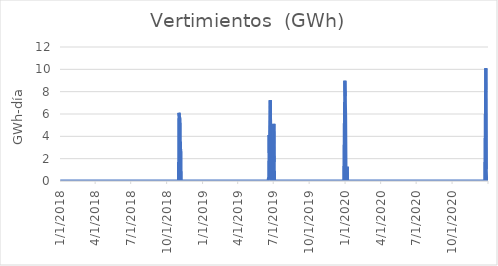
| Category | Vertimientos  (GWh) |
|---|---|
| 1/1/18 | 0 |
| 1/2/18 | 0 |
| 1/3/18 | 0 |
| 1/4/18 | 0 |
| 1/5/18 | 0 |
| 1/6/18 | 0 |
| 1/7/18 | 0 |
| 1/8/18 | 0 |
| 1/9/18 | 0 |
| 1/10/18 | 0 |
| 1/11/18 | 0 |
| 1/12/18 | 0 |
| 1/13/18 | 0 |
| 1/14/18 | 0 |
| 1/15/18 | 0 |
| 1/16/18 | 0 |
| 1/17/18 | 0 |
| 1/18/18 | 0 |
| 1/19/18 | 0 |
| 1/20/18 | 0 |
| 1/21/18 | 0 |
| 1/22/18 | 0 |
| 1/23/18 | 0 |
| 1/24/18 | 0 |
| 1/25/18 | 0 |
| 1/26/18 | 0 |
| 1/27/18 | 0 |
| 1/28/18 | 0 |
| 1/29/18 | 0 |
| 1/30/18 | 0 |
| 1/31/18 | 0 |
| 2/1/18 | 0 |
| 2/2/18 | 0 |
| 2/3/18 | 0 |
| 2/4/18 | 0 |
| 2/5/18 | 0 |
| 2/6/18 | 0 |
| 2/7/18 | 0 |
| 2/8/18 | 0 |
| 2/9/18 | 0 |
| 2/10/18 | 0 |
| 2/11/18 | 0 |
| 2/12/18 | 0 |
| 2/13/18 | 0 |
| 2/14/18 | 0 |
| 2/15/18 | 0 |
| 2/16/18 | 0 |
| 2/17/18 | 0 |
| 2/18/18 | 0 |
| 2/19/18 | 0 |
| 2/20/18 | 0 |
| 2/21/18 | 0 |
| 2/22/18 | 0 |
| 2/23/18 | 0 |
| 2/24/18 | 0 |
| 2/25/18 | 0 |
| 2/26/18 | 0 |
| 2/27/18 | 0 |
| 2/28/18 | 0 |
| 3/1/18 | 0 |
| 3/2/18 | 0 |
| 3/3/18 | 0 |
| 3/4/18 | 0 |
| 3/5/18 | 0 |
| 3/6/18 | 0 |
| 3/7/18 | 0 |
| 3/8/18 | 0 |
| 3/9/18 | 0 |
| 3/10/18 | 0 |
| 3/11/18 | 0 |
| 3/12/18 | 0 |
| 3/13/18 | 0 |
| 3/14/18 | 0 |
| 3/15/18 | 0 |
| 3/16/18 | 0 |
| 3/17/18 | 0 |
| 3/18/18 | 0 |
| 3/19/18 | 0 |
| 3/20/18 | 0 |
| 3/21/18 | 0 |
| 3/22/18 | 0 |
| 3/23/18 | 0 |
| 3/24/18 | 0 |
| 3/25/18 | 0 |
| 3/26/18 | 0 |
| 3/27/18 | 0 |
| 3/28/18 | 0 |
| 3/29/18 | 0 |
| 3/30/18 | 0 |
| 3/31/18 | 0 |
| 4/1/18 | 0 |
| 4/2/18 | 0 |
| 4/3/18 | 0 |
| 4/4/18 | 0 |
| 4/5/18 | 0 |
| 4/6/18 | 0 |
| 4/7/18 | 0 |
| 4/8/18 | 0 |
| 4/9/18 | 0 |
| 4/10/18 | 0 |
| 4/11/18 | 0 |
| 4/12/18 | 0 |
| 4/13/18 | 0 |
| 4/14/18 | 0 |
| 4/15/18 | 0 |
| 4/16/18 | 0 |
| 4/17/18 | 0 |
| 4/18/18 | 0 |
| 4/19/18 | 0 |
| 4/20/18 | 0 |
| 4/21/18 | 0 |
| 4/22/18 | 0 |
| 4/23/18 | 0 |
| 4/24/18 | 0 |
| 4/25/18 | 0 |
| 4/26/18 | 0 |
| 4/27/18 | 0 |
| 4/28/18 | 0 |
| 4/29/18 | 0 |
| 4/30/18 | 0 |
| 5/1/18 | 0 |
| 5/2/18 | 0 |
| 5/3/18 | 0 |
| 5/4/18 | 0 |
| 5/5/18 | 0 |
| 5/6/18 | 0 |
| 5/7/18 | 0 |
| 5/8/18 | 0 |
| 5/9/18 | 0 |
| 5/10/18 | 0 |
| 5/11/18 | 0 |
| 5/12/18 | 0 |
| 5/13/18 | 0 |
| 5/14/18 | 0 |
| 5/15/18 | 0 |
| 5/16/18 | 0 |
| 5/17/18 | 0 |
| 5/18/18 | 0 |
| 5/19/18 | 0 |
| 5/20/18 | 0 |
| 5/21/18 | 0 |
| 5/22/18 | 0 |
| 5/23/18 | 0 |
| 5/24/18 | 0 |
| 5/25/18 | 0 |
| 5/26/18 | 0 |
| 5/27/18 | 0 |
| 5/28/18 | 0 |
| 5/29/18 | 0 |
| 5/30/18 | 0 |
| 5/31/18 | 0 |
| 6/1/18 | 0 |
| 6/2/18 | 0 |
| 6/3/18 | 0 |
| 6/4/18 | 0 |
| 6/5/18 | 0 |
| 6/6/18 | 0 |
| 6/7/18 | 0 |
| 6/8/18 | 0 |
| 6/9/18 | 0 |
| 6/10/18 | 0 |
| 6/11/18 | 0 |
| 6/12/18 | 0 |
| 6/13/18 | 0 |
| 6/14/18 | 0 |
| 6/15/18 | 0 |
| 6/16/18 | 0 |
| 6/17/18 | 0 |
| 6/18/18 | 0 |
| 6/19/18 | 0 |
| 6/20/18 | 0 |
| 6/21/18 | 0 |
| 6/22/18 | 0 |
| 6/23/18 | 0 |
| 6/24/18 | 0 |
| 6/25/18 | 0 |
| 6/26/18 | 0 |
| 6/27/18 | 0 |
| 6/28/18 | 0 |
| 6/29/18 | 0 |
| 6/30/18 | 0 |
| 7/1/18 | 0 |
| 7/2/18 | 0 |
| 7/3/18 | 0 |
| 7/4/18 | 0 |
| 7/5/18 | 0 |
| 7/6/18 | 0 |
| 7/7/18 | 0 |
| 7/8/18 | 0 |
| 7/9/18 | 0 |
| 7/10/18 | 0 |
| 7/11/18 | 0 |
| 7/12/18 | 0 |
| 7/13/18 | 0 |
| 7/14/18 | 0 |
| 7/15/18 | 0 |
| 7/16/18 | 0 |
| 7/17/18 | 0 |
| 7/18/18 | 0 |
| 7/19/18 | 0 |
| 7/20/18 | 0 |
| 7/21/18 | 0 |
| 7/22/18 | 0 |
| 7/23/18 | 0 |
| 7/24/18 | 0 |
| 7/25/18 | 0 |
| 7/26/18 | 0 |
| 7/27/18 | 0 |
| 7/28/18 | 0 |
| 7/29/18 | 0 |
| 7/30/18 | 0 |
| 7/31/18 | 0 |
| 8/1/18 | 0 |
| 8/2/18 | 0 |
| 8/3/18 | 0 |
| 8/4/18 | 0 |
| 8/5/18 | 0 |
| 8/6/18 | 0 |
| 8/7/18 | 0 |
| 8/8/18 | 0 |
| 8/9/18 | 0 |
| 8/10/18 | 0 |
| 8/11/18 | 0 |
| 8/12/18 | 0 |
| 8/13/18 | 0 |
| 8/14/18 | 0 |
| 8/15/18 | 0 |
| 8/16/18 | 0 |
| 8/17/18 | 0 |
| 8/18/18 | 0 |
| 8/19/18 | 0 |
| 8/20/18 | 0 |
| 8/21/18 | 0 |
| 8/22/18 | 0 |
| 8/23/18 | 0 |
| 8/24/18 | 0 |
| 8/25/18 | 0 |
| 8/26/18 | 0 |
| 8/27/18 | 0 |
| 8/28/18 | 0 |
| 8/29/18 | 0 |
| 8/30/18 | 0 |
| 8/31/18 | 0 |
| 9/1/18 | 0 |
| 9/2/18 | 0 |
| 9/3/18 | 0 |
| 9/4/18 | 0 |
| 9/5/18 | 0 |
| 9/6/18 | 0 |
| 9/7/18 | 0 |
| 9/8/18 | 0 |
| 9/9/18 | 0 |
| 9/10/18 | 0 |
| 9/11/18 | 0 |
| 9/12/18 | 0 |
| 9/13/18 | 0 |
| 9/14/18 | 0 |
| 9/15/18 | 0 |
| 9/16/18 | 0 |
| 9/17/18 | 0 |
| 9/18/18 | 0 |
| 9/19/18 | 0 |
| 9/20/18 | 0 |
| 9/21/18 | 0 |
| 9/22/18 | 0 |
| 9/23/18 | 0 |
| 9/24/18 | 0 |
| 9/25/18 | 0 |
| 9/26/18 | 0 |
| 9/27/18 | 0 |
| 9/28/18 | 0 |
| 9/29/18 | 0 |
| 9/30/18 | 0 |
| 10/1/18 | 0 |
| 10/2/18 | 0 |
| 10/3/18 | 0 |
| 10/4/18 | 0 |
| 10/5/18 | 0 |
| 10/6/18 | 0 |
| 10/7/18 | 0 |
| 10/8/18 | 0 |
| 10/9/18 | 0 |
| 10/10/18 | 0 |
| 10/11/18 | 0 |
| 10/12/18 | 0 |
| 10/13/18 | 0 |
| 10/14/18 | 0 |
| 10/15/18 | 0 |
| 10/16/18 | 0 |
| 10/17/18 | 0 |
| 10/18/18 | 0 |
| 10/19/18 | 0 |
| 10/20/18 | 0 |
| 10/21/18 | 0 |
| 10/22/18 | 0 |
| 10/23/18 | 0 |
| 10/24/18 | 0 |
| 10/25/18 | 0 |
| 10/26/18 | 0 |
| 10/27/18 | 0 |
| 10/28/18 | 0 |
| 10/29/18 | 0 |
| 10/30/18 | 0 |
| 10/31/18 | 0 |
| 11/1/18 | 6.102 |
| 11/2/18 | 5.848 |
| 11/3/18 | 5.917 |
| 11/4/18 | 5.528 |
| 11/5/18 | 2.917 |
| 11/6/18 | 2.766 |
| 11/7/18 | 0 |
| 11/8/18 | 0 |
| 11/9/18 | 0 |
| 11/10/18 | 0 |
| 11/11/18 | 0 |
| 11/12/18 | 0 |
| 11/13/18 | 0 |
| 11/14/18 | 0 |
| 11/15/18 | 0 |
| 11/16/18 | 0 |
| 11/17/18 | 0 |
| 11/18/18 | 0 |
| 11/19/18 | 0 |
| 11/20/18 | 0 |
| 11/21/18 | 0 |
| 11/22/18 | 0 |
| 11/23/18 | 0 |
| 11/24/18 | 0 |
| 11/25/18 | 0 |
| 11/26/18 | 0 |
| 11/27/18 | 0 |
| 11/28/18 | 0 |
| 11/29/18 | 0 |
| 11/30/18 | 0 |
| 12/1/18 | 0 |
| 12/2/18 | 0 |
| 12/3/18 | 0 |
| 12/4/18 | 0 |
| 12/5/18 | 0 |
| 12/6/18 | 0 |
| 12/7/18 | 0 |
| 12/8/18 | 0 |
| 12/9/18 | 0 |
| 12/10/18 | 0 |
| 12/11/18 | 0 |
| 12/12/18 | 0 |
| 12/13/18 | 0 |
| 12/14/18 | 0 |
| 12/15/18 | 0 |
| 12/16/18 | 0 |
| 12/17/18 | 0 |
| 12/18/18 | 0 |
| 12/19/18 | 0 |
| 12/20/18 | 0 |
| 12/21/18 | 0 |
| 12/22/18 | 0 |
| 12/23/18 | 0 |
| 12/24/18 | 0 |
| 12/25/18 | 0 |
| 12/26/18 | 0 |
| 12/27/18 | 0 |
| 12/28/18 | 0 |
| 12/29/18 | 0 |
| 12/30/18 | 0 |
| 12/31/18 | 0 |
| 1/1/19 | 0 |
| 1/2/19 | 0 |
| 1/3/19 | 0 |
| 1/4/19 | 0 |
| 1/5/19 | 0 |
| 1/6/19 | 0 |
| 1/7/19 | 0 |
| 1/8/19 | 0 |
| 1/9/19 | 0 |
| 1/10/19 | 0 |
| 1/11/19 | 0 |
| 1/12/19 | 0 |
| 1/13/19 | 0 |
| 1/14/19 | 0 |
| 1/15/19 | 0 |
| 1/16/19 | 0 |
| 1/17/19 | 0 |
| 1/18/19 | 0 |
| 1/19/19 | 0 |
| 1/20/19 | 0 |
| 1/21/19 | 0 |
| 1/22/19 | 0 |
| 1/23/19 | 0 |
| 1/24/19 | 0 |
| 1/25/19 | 0 |
| 1/26/19 | 0 |
| 1/27/19 | 0 |
| 1/28/19 | 0 |
| 1/29/19 | 0 |
| 1/30/19 | 0 |
| 1/31/19 | 0 |
| 2/1/19 | 0 |
| 2/2/19 | 0 |
| 2/3/19 | 0 |
| 2/4/19 | 0 |
| 2/5/19 | 0 |
| 2/6/19 | 0 |
| 2/7/19 | 0 |
| 2/8/19 | 0 |
| 2/9/19 | 0 |
| 2/10/19 | 0 |
| 2/11/19 | 0 |
| 2/12/19 | 0 |
| 2/13/19 | 0 |
| 2/14/19 | 0 |
| 2/15/19 | 0 |
| 2/16/19 | 0 |
| 2/17/19 | 0 |
| 2/18/19 | 0 |
| 2/19/19 | 0 |
| 2/20/19 | 0 |
| 2/21/19 | 0 |
| 2/22/19 | 0 |
| 2/23/19 | 0 |
| 2/24/19 | 0 |
| 2/25/19 | 0 |
| 2/26/19 | 0 |
| 2/27/19 | 0 |
| 2/28/19 | 0 |
| 3/1/19 | 0 |
| 3/2/19 | 0 |
| 3/3/19 | 0 |
| 3/4/19 | 0 |
| 3/5/19 | 0 |
| 3/6/19 | 0 |
| 3/7/19 | 0 |
| 3/8/19 | 0 |
| 3/9/19 | 0 |
| 3/10/19 | 0 |
| 3/11/19 | 0 |
| 3/12/19 | 0 |
| 3/13/19 | 0 |
| 3/14/19 | 0 |
| 3/15/19 | 0 |
| 3/16/19 | 0 |
| 3/17/19 | 0 |
| 3/18/19 | 0 |
| 3/19/19 | 0 |
| 3/20/19 | 0 |
| 3/21/19 | 0 |
| 3/22/19 | 0 |
| 3/23/19 | 0 |
| 3/24/19 | 0 |
| 3/25/19 | 0 |
| 3/26/19 | 0 |
| 3/27/19 | 0 |
| 3/28/19 | 0 |
| 3/29/19 | 0 |
| 3/30/19 | 0 |
| 3/31/19 | 0 |
| 4/1/19 | 0 |
| 4/2/19 | 0 |
| 4/3/19 | 0 |
| 4/4/19 | 0 |
| 4/5/19 | 0 |
| 4/6/19 | 0 |
| 4/7/19 | 0 |
| 4/8/19 | 0 |
| 4/9/19 | 0 |
| 4/10/19 | 0 |
| 4/11/19 | 0 |
| 4/12/19 | 0 |
| 4/13/19 | 0 |
| 4/14/19 | 0 |
| 4/15/19 | 0 |
| 4/16/19 | 0 |
| 4/17/19 | 0 |
| 4/18/19 | 0 |
| 4/19/19 | 0 |
| 4/20/19 | 0 |
| 4/21/19 | 0 |
| 4/22/19 | 0 |
| 4/23/19 | 0 |
| 4/24/19 | 0 |
| 4/25/19 | 0 |
| 4/26/19 | 0 |
| 4/27/19 | 0 |
| 4/28/19 | 0 |
| 4/29/19 | 0 |
| 4/30/19 | 0 |
| 5/1/19 | 0 |
| 5/2/19 | 0 |
| 5/3/19 | 0 |
| 5/4/19 | 0 |
| 5/5/19 | 0 |
| 5/6/19 | 0 |
| 5/7/19 | 0 |
| 5/8/19 | 0 |
| 5/9/19 | 0 |
| 5/10/19 | 0 |
| 5/11/19 | 0 |
| 5/12/19 | 0 |
| 5/13/19 | 0 |
| 5/14/19 | 0 |
| 5/15/19 | 0 |
| 5/16/19 | 0 |
| 5/17/19 | 0 |
| 5/18/19 | 0 |
| 5/19/19 | 0 |
| 5/20/19 | 0 |
| 5/21/19 | 0 |
| 5/22/19 | 0 |
| 5/23/19 | 0 |
| 5/24/19 | 0 |
| 5/25/19 | 0 |
| 5/26/19 | 0 |
| 5/27/19 | 0 |
| 5/28/19 | 0 |
| 5/29/19 | 0 |
| 5/30/19 | 0 |
| 5/31/19 | 0 |
| 6/1/19 | 0 |
| 6/2/19 | 0 |
| 6/3/19 | 0 |
| 6/4/19 | 0 |
| 6/5/19 | 0 |
| 6/6/19 | 0 |
| 6/7/19 | 0 |
| 6/8/19 | 0 |
| 6/9/19 | 0 |
| 6/10/19 | 0 |
| 6/11/19 | 0 |
| 6/12/19 | 0 |
| 6/13/19 | 0 |
| 6/14/19 | 0 |
| 6/15/19 | 0 |
| 6/16/19 | 0 |
| 6/17/19 | 0 |
| 6/18/19 | 0 |
| 6/19/19 | 0.379 |
| 6/20/19 | 4.089 |
| 6/21/19 | 1.693 |
| 6/22/19 | 1.711 |
| 6/23/19 | 7.235 |
| 6/24/19 | 4.426 |
| 6/25/19 | 0 |
| 6/26/19 | 3.737 |
| 6/27/19 | 0 |
| 6/28/19 | 0 |
| 6/29/19 | 0 |
| 6/30/19 | 1.952 |
| 7/1/19 | 0.442 |
| 7/2/19 | 5.115 |
| 7/3/19 | 1.692 |
| 7/4/19 | 0.068 |
| 7/5/19 | 0 |
| 7/6/19 | 0 |
| 7/7/19 | 0 |
| 7/8/19 | 0 |
| 7/9/19 | 0 |
| 7/10/19 | 0 |
| 7/11/19 | 0 |
| 7/12/19 | 0 |
| 7/13/19 | 0 |
| 7/14/19 | 0 |
| 7/15/19 | 0 |
| 7/16/19 | 0 |
| 7/17/19 | 0 |
| 7/18/19 | 0 |
| 7/19/19 | 0 |
| 7/20/19 | 0 |
| 7/21/19 | 0 |
| 7/22/19 | 0 |
| 7/23/19 | 0 |
| 7/24/19 | 0 |
| 7/25/19 | 0 |
| 7/26/19 | 0 |
| 7/27/19 | 0 |
| 7/28/19 | 0 |
| 7/29/19 | 0 |
| 7/30/19 | 0 |
| 7/31/19 | 0 |
| 8/1/19 | 0 |
| 8/2/19 | 0 |
| 8/3/19 | 0 |
| 8/4/19 | 0 |
| 8/5/19 | 0 |
| 8/6/19 | 0 |
| 8/7/19 | 0 |
| 8/8/19 | 0 |
| 8/9/19 | 0 |
| 8/10/19 | 0 |
| 8/11/19 | 0 |
| 8/12/19 | 0 |
| 8/13/19 | 0 |
| 8/14/19 | 0 |
| 8/15/19 | 0 |
| 8/16/19 | 0 |
| 8/17/19 | 0 |
| 8/18/19 | 0 |
| 8/19/19 | 0 |
| 8/20/19 | 0 |
| 8/21/19 | 0 |
| 8/22/19 | 0 |
| 8/23/19 | 0 |
| 8/24/19 | 0 |
| 8/25/19 | 0 |
| 8/26/19 | 0 |
| 8/27/19 | 0 |
| 8/28/19 | 0 |
| 8/29/19 | 0 |
| 8/30/19 | 0 |
| 8/31/19 | 0 |
| 9/1/19 | 0 |
| 9/2/19 | 0 |
| 9/3/19 | 0 |
| 9/4/19 | 0 |
| 9/5/19 | 0 |
| 9/6/19 | 0 |
| 9/7/19 | 0 |
| 9/8/19 | 0 |
| 9/9/19 | 0 |
| 9/10/19 | 0 |
| 9/11/19 | 0 |
| 9/12/19 | 0 |
| 9/13/19 | 0 |
| 9/14/19 | 0 |
| 9/15/19 | 0 |
| 9/16/19 | 0 |
| 9/17/19 | 0 |
| 9/18/19 | 0 |
| 9/19/19 | 0 |
| 9/20/19 | 0 |
| 9/21/19 | 0 |
| 9/22/19 | 0 |
| 9/23/19 | 0 |
| 9/24/19 | 0 |
| 9/25/19 | 0 |
| 9/26/19 | 0 |
| 9/27/19 | 0 |
| 9/28/19 | 0 |
| 9/29/19 | 0 |
| 9/30/19 | 0 |
| 10/1/19 | 0 |
| 10/2/19 | 0 |
| 10/3/19 | 0 |
| 10/4/19 | 0 |
| 10/5/19 | 0 |
| 10/6/19 | 0 |
| 10/7/19 | 0 |
| 10/8/19 | 0 |
| 10/9/19 | 0 |
| 10/10/19 | 0 |
| 10/11/19 | 0 |
| 10/12/19 | 0 |
| 10/13/19 | 0 |
| 10/14/19 | 0 |
| 10/15/19 | 0 |
| 10/16/19 | 0 |
| 10/17/19 | 0 |
| 10/18/19 | 0 |
| 10/19/19 | 0 |
| 10/20/19 | 0 |
| 10/21/19 | 0 |
| 10/22/19 | 0 |
| 10/23/19 | 0 |
| 10/24/19 | 0 |
| 10/25/19 | 0 |
| 10/26/19 | 0 |
| 10/27/19 | 0 |
| 10/28/19 | 0 |
| 10/29/19 | 0 |
| 10/30/19 | 0 |
| 10/31/19 | 0 |
| 11/1/19 | 0 |
| 11/2/19 | 0 |
| 11/3/19 | 0 |
| 11/4/19 | 0 |
| 11/5/19 | 0 |
| 11/6/19 | 0 |
| 11/7/19 | 0 |
| 11/8/19 | 0 |
| 11/9/19 | 0 |
| 11/10/19 | 0 |
| 11/11/19 | 0 |
| 11/12/19 | 0 |
| 11/13/19 | 0 |
| 11/14/19 | 0 |
| 11/15/19 | 0 |
| 11/16/19 | 0 |
| 11/17/19 | 0 |
| 11/18/19 | 0 |
| 11/19/19 | 0 |
| 11/20/19 | 0 |
| 11/21/19 | 0 |
| 11/22/19 | 0 |
| 11/23/19 | 0 |
| 11/24/19 | 0 |
| 11/25/19 | 0 |
| 11/26/19 | 0 |
| 11/27/19 | 0 |
| 11/28/19 | 0 |
| 11/29/19 | 0 |
| 11/30/19 | 0 |
| 12/1/19 | 0 |
| 12/2/19 | 0 |
| 12/3/19 | 0 |
| 12/4/19 | 0 |
| 12/5/19 | 0 |
| 12/6/19 | 0 |
| 12/7/19 | 0 |
| 12/8/19 | 0 |
| 12/9/19 | 0 |
| 12/10/19 | 0 |
| 12/11/19 | 0 |
| 12/12/19 | 0 |
| 12/13/19 | 0 |
| 12/14/19 | 0 |
| 12/15/19 | 0 |
| 12/16/19 | 0 |
| 12/17/19 | 0 |
| 12/18/19 | 0 |
| 12/19/19 | 0 |
| 12/20/19 | 0 |
| 12/21/19 | 0 |
| 12/22/19 | 0 |
| 12/23/19 | 0 |
| 12/24/19 | 0 |
| 12/25/19 | 0 |
| 12/26/19 | 0 |
| 12/27/19 | 0 |
| 12/28/19 | 0 |
| 12/29/19 | 0 |
| 12/30/19 | 0 |
| 12/31/19 | 8.97 |
| 1/1/20 | 7.592 |
| 1/2/20 | 5.743 |
| 1/3/20 | 0 |
| 1/4/20 | 0 |
| 1/5/20 | 0.143 |
| 1/6/20 | 1.273 |
| 1/7/20 | 0 |
| 1/8/20 | 0 |
| 1/9/20 | 0 |
| 1/10/20 | 0 |
| 1/11/20 | 0 |
| 1/12/20 | 0 |
| 1/13/20 | 0 |
| 1/14/20 | 0 |
| 1/15/20 | 0 |
| 1/16/20 | 0 |
| 1/17/20 | 0 |
| 1/18/20 | 0 |
| 1/19/20 | 0 |
| 1/20/20 | 0 |
| 1/21/20 | 0 |
| 1/22/20 | 0 |
| 1/23/20 | 0 |
| 1/24/20 | 0 |
| 1/25/20 | 0 |
| 1/26/20 | 0 |
| 1/27/20 | 0 |
| 1/28/20 | 0 |
| 1/29/20 | 0 |
| 1/30/20 | 0 |
| 1/31/20 | 0 |
| 2/1/20 | 0 |
| 2/2/20 | 0 |
| 2/3/20 | 0 |
| 2/4/20 | 0 |
| 2/5/20 | 0 |
| 2/6/20 | 0 |
| 2/7/20 | 0 |
| 2/8/20 | 0 |
| 2/9/20 | 0 |
| 2/10/20 | 0 |
| 2/11/20 | 0 |
| 2/12/20 | 0 |
| 2/13/20 | 0 |
| 2/14/20 | 0 |
| 2/15/20 | 0 |
| 2/16/20 | 0 |
| 2/17/20 | 0 |
| 2/18/20 | 0 |
| 2/19/20 | 0 |
| 2/20/20 | 0 |
| 2/21/20 | 0 |
| 2/22/20 | 0 |
| 2/23/20 | 0 |
| 2/24/20 | 0 |
| 2/25/20 | 0 |
| 2/26/20 | 0 |
| 2/27/20 | 0 |
| 2/28/20 | 0 |
| 2/29/20 | 0 |
| 3/1/20 | 0 |
| 3/2/20 | 0 |
| 3/3/20 | 0 |
| 3/4/20 | 0 |
| 3/5/20 | 0 |
| 3/6/20 | 0 |
| 3/7/20 | 0 |
| 3/8/20 | 0 |
| 3/9/20 | 0 |
| 3/10/20 | 0 |
| 3/11/20 | 0 |
| 3/12/20 | 0 |
| 3/13/20 | 0 |
| 3/14/20 | 0 |
| 3/15/20 | 0 |
| 3/16/20 | 0 |
| 3/17/20 | 0 |
| 3/18/20 | 0 |
| 3/19/20 | 0 |
| 3/20/20 | 0 |
| 3/21/20 | 0 |
| 3/22/20 | 0 |
| 3/23/20 | 0 |
| 3/24/20 | 0 |
| 3/25/20 | 0 |
| 3/26/20 | 0 |
| 3/27/20 | 0 |
| 3/28/20 | 0 |
| 3/29/20 | 0 |
| 3/30/20 | 0 |
| 3/31/20 | 0 |
| 4/1/20 | 0 |
| 4/2/20 | 0 |
| 4/3/20 | 0 |
| 4/4/20 | 0 |
| 4/5/20 | 0 |
| 4/6/20 | 0 |
| 4/7/20 | 0 |
| 4/8/20 | 0 |
| 4/9/20 | 0 |
| 4/10/20 | 0 |
| 4/11/20 | 0 |
| 4/12/20 | 0 |
| 4/13/20 | 0 |
| 4/14/20 | 0 |
| 4/15/20 | 0 |
| 4/16/20 | 0 |
| 4/17/20 | 0 |
| 4/18/20 | 0 |
| 4/19/20 | 0 |
| 4/20/20 | 0 |
| 4/21/20 | 0 |
| 4/22/20 | 0 |
| 4/23/20 | 0 |
| 4/24/20 | 0 |
| 4/25/20 | 0 |
| 4/26/20 | 0 |
| 4/27/20 | 0 |
| 4/28/20 | 0 |
| 4/29/20 | 0 |
| 4/30/20 | 0 |
| 5/1/20 | 0 |
| 5/2/20 | 0 |
| 5/3/20 | 0 |
| 5/4/20 | 0 |
| 5/5/20 | 0 |
| 5/6/20 | 0 |
| 5/7/20 | 0 |
| 5/8/20 | 0 |
| 5/9/20 | 0 |
| 5/10/20 | 0 |
| 5/11/20 | 0 |
| 5/12/20 | 0 |
| 5/13/20 | 0 |
| 5/14/20 | 0 |
| 5/15/20 | 0 |
| 5/16/20 | 0 |
| 5/17/20 | 0 |
| 5/18/20 | 0 |
| 5/19/20 | 0 |
| 5/20/20 | 0 |
| 5/21/20 | 0 |
| 5/22/20 | 0 |
| 5/23/20 | 0 |
| 5/24/20 | 0 |
| 5/25/20 | 0 |
| 5/26/20 | 0 |
| 5/27/20 | 0 |
| 5/28/20 | 0 |
| 5/29/20 | 0 |
| 5/30/20 | 0 |
| 5/31/20 | 0 |
| 6/1/20 | 0 |
| 6/2/20 | 0 |
| 6/3/20 | 0 |
| 6/4/20 | 0 |
| 6/5/20 | 0 |
| 6/6/20 | 0 |
| 6/7/20 | 0 |
| 6/8/20 | 0 |
| 6/9/20 | 0 |
| 6/10/20 | 0 |
| 6/11/20 | 0 |
| 6/12/20 | 0 |
| 6/13/20 | 0 |
| 6/14/20 | 0 |
| 6/15/20 | 0 |
| 6/16/20 | 0 |
| 6/17/20 | 0 |
| 6/18/20 | 0 |
| 6/19/20 | 0 |
| 6/20/20 | 0 |
| 6/21/20 | 0 |
| 6/22/20 | 0 |
| 6/23/20 | 0 |
| 6/24/20 | 0 |
| 6/25/20 | 0 |
| 6/26/20 | 0 |
| 6/27/20 | 0 |
| 6/28/20 | 0 |
| 6/29/20 | 0 |
| 6/30/20 | 0 |
| 7/1/20 | 0 |
| 7/2/20 | 0 |
| 7/3/20 | 0 |
| 7/4/20 | 0 |
| 7/5/20 | 0 |
| 7/6/20 | 0 |
| 7/7/20 | 0 |
| 7/8/20 | 0 |
| 7/9/20 | 0 |
| 7/10/20 | 0 |
| 7/11/20 | 0 |
| 7/12/20 | 0 |
| 7/13/20 | 0 |
| 7/14/20 | 0 |
| 7/15/20 | 0 |
| 7/16/20 | 0 |
| 7/17/20 | 0 |
| 7/18/20 | 0 |
| 7/19/20 | 0 |
| 7/20/20 | 0 |
| 7/21/20 | 0 |
| 7/22/20 | 0 |
| 7/23/20 | 0 |
| 7/24/20 | 0 |
| 7/25/20 | 0 |
| 7/26/20 | 0 |
| 7/27/20 | 0 |
| 7/28/20 | 0 |
| 7/29/20 | 0 |
| 7/30/20 | 0 |
| 7/31/20 | 0 |
| 8/1/20 | 0 |
| 8/2/20 | 0 |
| 8/3/20 | 0 |
| 8/4/20 | 0 |
| 8/5/20 | 0 |
| 8/6/20 | 0 |
| 8/7/20 | 0 |
| 8/8/20 | 0 |
| 8/9/20 | 0 |
| 8/10/20 | 0 |
| 8/11/20 | 0 |
| 8/12/20 | 0 |
| 8/13/20 | 0 |
| 8/14/20 | 0 |
| 8/15/20 | 0 |
| 8/16/20 | 0 |
| 8/17/20 | 0 |
| 8/18/20 | 0 |
| 8/19/20 | 0 |
| 8/20/20 | 0 |
| 8/21/20 | 0 |
| 8/22/20 | 0 |
| 8/23/20 | 0 |
| 8/24/20 | 0 |
| 8/25/20 | 0 |
| 8/26/20 | 0 |
| 8/27/20 | 0 |
| 8/28/20 | 0 |
| 8/29/20 | 0 |
| 8/30/20 | 0 |
| 8/31/20 | 0 |
| 9/1/20 | 0 |
| 9/2/20 | 0 |
| 9/3/20 | 0 |
| 9/4/20 | 0 |
| 9/5/20 | 0 |
| 9/6/20 | 0 |
| 9/7/20 | 0 |
| 9/8/20 | 0 |
| 9/9/20 | 0 |
| 9/10/20 | 0 |
| 9/11/20 | 0 |
| 9/12/20 | 0 |
| 9/13/20 | 0 |
| 9/14/20 | 0 |
| 9/15/20 | 0 |
| 9/16/20 | 0 |
| 9/17/20 | 0 |
| 9/18/20 | 0 |
| 9/19/20 | 0 |
| 9/20/20 | 0 |
| 9/21/20 | 0 |
| 9/22/20 | 0 |
| 9/23/20 | 0 |
| 9/24/20 | 0 |
| 9/25/20 | 0 |
| 9/26/20 | 0 |
| 9/27/20 | 0 |
| 9/28/20 | 0 |
| 9/29/20 | 0 |
| 9/30/20 | 0 |
| 10/1/20 | 0 |
| 10/2/20 | 0 |
| 10/3/20 | 0 |
| 10/4/20 | 0 |
| 10/5/20 | 0 |
| 10/6/20 | 0 |
| 10/7/20 | 0 |
| 10/8/20 | 0 |
| 10/9/20 | 0 |
| 10/10/20 | 0 |
| 10/11/20 | 0 |
| 10/12/20 | 0 |
| 10/13/20 | 0 |
| 10/14/20 | 0 |
| 10/15/20 | 0 |
| 10/16/20 | 0 |
| 10/17/20 | 0 |
| 10/18/20 | 0 |
| 10/19/20 | 0 |
| 10/20/20 | 0 |
| 10/21/20 | 0 |
| 10/22/20 | 0 |
| 10/23/20 | 0 |
| 10/24/20 | 0 |
| 10/25/20 | 0 |
| 10/26/20 | 0 |
| 10/27/20 | 0 |
| 10/28/20 | 0 |
| 10/29/20 | 0 |
| 10/30/20 | 0 |
| 10/31/20 | 0 |
| 11/1/20 | 0 |
| 11/2/20 | 0 |
| 11/3/20 | 0 |
| 11/4/20 | 0 |
| 11/5/20 | 0 |
| 11/6/20 | 0 |
| 11/7/20 | 0 |
| 11/8/20 | 0 |
| 11/9/20 | 0 |
| 11/10/20 | 0 |
| 11/11/20 | 0 |
| 11/12/20 | 0 |
| 11/13/20 | 0 |
| 11/14/20 | 0 |
| 11/15/20 | 0 |
| 11/16/20 | 0 |
| 11/17/20 | 0 |
| 11/18/20 | 0 |
| 11/19/20 | 0 |
| 11/20/20 | 0 |
| 11/21/20 | 0 |
| 11/22/20 | 0 |
| 11/23/20 | 0 |
| 11/24/20 | 0 |
| 11/25/20 | 0 |
| 11/26/20 | 0 |
| 11/27/20 | 0 |
| 11/28/20 | 0 |
| 11/29/20 | 0 |
| 11/30/20 | 0 |
| 12/1/20 | 0 |
| 12/2/20 | 0 |
| 12/3/20 | 0 |
| 12/4/20 | 0 |
| 12/5/20 | 0 |
| 12/6/20 | 0 |
| 12/7/20 | 0 |
| 12/8/20 | 0 |
| 12/9/20 | 0 |
| 12/10/20 | 0 |
| 12/11/20 | 0 |
| 12/12/20 | 0 |
| 12/13/20 | 0 |
| 12/14/20 | 0 |
| 12/15/20 | 0 |
| 12/16/20 | 0 |
| 12/17/20 | 0 |
| 12/18/20 | 0 |
| 12/19/20 | 0 |
| 12/20/20 | 0 |
| 12/21/20 | 0 |
| 12/22/20 | 0 |
| 12/23/20 | 0 |
| 12/24/20 | 0 |
| 12/25/20 | 0 |
| 12/26/20 | 10.101 |
| 12/27/20 | 1.041 |
| 12/28/20 | 0 |
| 12/29/20 | 0 |
| 12/30/20 | 0 |
| 12/31/20 | 0 |